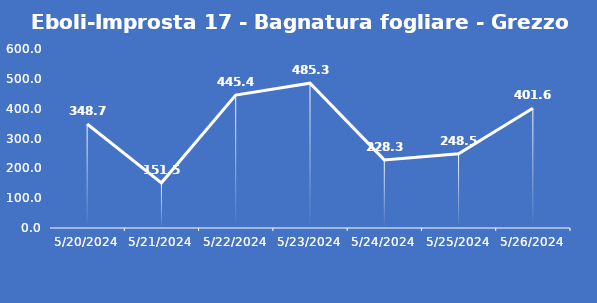
| Category | Eboli-Improsta 17 - Bagnatura fogliare - Grezzo (min) |
|---|---|
| 5/20/24 | 348.7 |
| 5/21/24 | 151.5 |
| 5/22/24 | 445.4 |
| 5/23/24 | 485.3 |
| 5/24/24 | 228.3 |
| 5/25/24 | 248.5 |
| 5/26/24 | 401.6 |